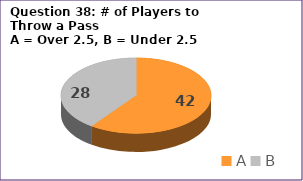
| Category | Series 0 |
|---|---|
| A | 42 |
| B | 28 |